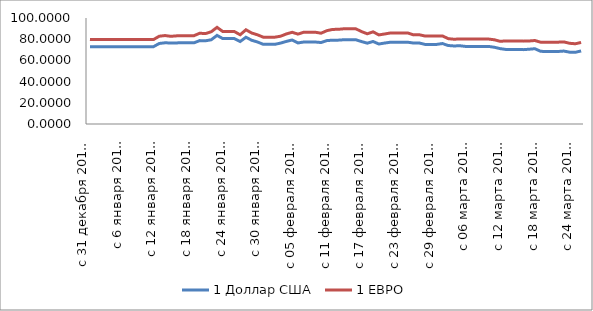
| Category | 1 Доллар США | 1 ЕВРО |
|---|---|---|
| с 31 декабря 2015 года | 72.883 | 79.697 |
| с 1 января 2016 года | 72.93 | 79.64 |
| со 2 января 2016 года | 72.93 | 79.64 |
| с 3 января 2016 года | 72.93 | 79.64 |
| с 4 января 2016 года | 72.93 | 79.64 |
| с 5 января 2016 года | 72.93 | 79.64 |
| с 6 января 2016 года | 72.93 | 79.64 |
| с 7 января 2016 года | 72.93 | 79.64 |
| с 8 января 2016 года | 72.93 | 79.64 |
| с 9 января 2016 года | 72.93 | 79.64 |
| с 10 января 2016 года | 72.93 | 79.64 |
| с 11 января 2016 года | 72.93 | 79.64 |
| с 12 января 2016 года | 75.951 | 82.809 |
| с 13 января 2016 года | 76.604 | 83.437 |
| с 14 января 2016 года | 76.428 | 82.718 |
| с 15 января 2016 года | 76.523 | 83.15 |
| с 16 января 2016 года | 76.565 | 83.295 |
| с 17 января 2016 года | 76.565 | 83.295 |
| с 18 января 2016 года | 76.565 | 83.295 |
| с 19 января 2016 года | 78.668 | 85.622 |
| с 20 января 2016 года | 78.486 | 85.299 |
| с 21 января 2016 года | 79.461 | 87.034 |
| с 22 января 2016 года | 83.591 | 91.181 |
| с 23 января 2016 года | 80.571 | 87.227 |
| с 24 января 2016 года | 80.571 | 87.227 |
| с 25 января 2016 года | 80.571 | 87.227 |
| с 26 января 2016 года | 77.796 | 84.16 |
| с 27 января 2016 года | 81.839 | 88.886 |
| с 28 января 2016 года | 78.997 | 85.846 |
| с 29 января 2016 года | 77.367 | 84.137 |
| с 30 января 2016 года | 75.172 | 81.908 |
| с 31 января 2016 года | 75.172 | 81.908 |
| с 01 февраля 2016 года | 75.172 | 81.908 |
| с 02 февраля 2016 года | 76.326 | 82.814 |
| с 03 февраля 2016 года | 77.927 | 84.972 |
| с 04 февраля 2016 года | 79.259 | 86.512 |
| с 05 февраля 2016 года | 76.461 | 84.81 |
| с 06 февраля 2016 года | 77.341 | 86.575 |
| с 07 февраля 2016 года | 77.341 | 86.575 |
| с 08 февраля 2016 года | 77.341 | 86.575 |
| с 09 февраля 2016 года | 76.861 | 85.654 |
| с 10 февраля 2016 года | 78.68 | 88.044 |
| с 11 февраля 2016 года | 79.069 | 89.221 |
| с 12 февраля 2016 года | 79.114 | 89.344 |
| с 13 февраля 2016 года | 79.495 | 89.845 |
| с 14 февраля 2016 года | 79.495 | 89.845 |
| с 15 февраля 2016 года | 79.495 | 89.845 |
| с 16 февраля 2016 года | 77.779 | 87.19 |
| с 17 февраля 2016 года | 76.245 | 85.089 |
| с 18 февраля 2016 года | 77.85 | 86.959 |
| с 19 февраля 2016 года | 75.458 | 84.052 |
| с 20 февраля 2016 года | 76.366 | 84.919 |
| с 21 февраля 2016 года | 77.133 | 85.856 |
| с 22 февраля 2016 года | 77.133 | 85.856 |
| с 23 февраля 2016 года | 77.133 | 85.856 |
| с 24 февраля 2016 года | 77.133 | 85.856 |
| с 25 февраля 2016 года | 76.393 | 84.078 |
| с 26 февраля 2016 года | 76.393 | 84.216 |
| с 27 февраля 2016 года | 75.09 | 82.975 |
| с 28 февраля 2016 года | 75.09 | 82.975 |
| с 29 февраля 2016 года | 75.09 | 82.975 |
| с 01 марта 2016 года | 75.899 | 83.102 |
| с 02 марта 2016 года | 74.054 | 80.533 |
| с 03 марта 2016 года | 73.626 | 79.972 |
| с 04 марта 2016 года | 73.824 | 80.21 |
| с 05 марта 2016 года | 73.185 | 80.116 |
| с 06 марта 2016 года | 73.185 | 80.116 |
| с 07 марта 2016 года | 73.185 | 80.116 |
| с 08 марта 2016 года | 73.185 | 80.116 |
| с 09 марта 2016 года | 73.185 | 80.116 |
| с 10 марта 2016 года | 72.378 | 79.449 |
| с 11 марта 2016 года | 71.093 | 77.982 |
| с 12 марта 2016 года | 70.307 | 78.413 |
| с 13 марта 2016 года | 70.307 | 78.413 |
| с 14 марта 2016 года | 70.307 | 78.413 |
| с 15 марта 2016 года | 70.154 | 78.18 |
| с 16 марта 2016 года | 70.541 | 78.328 |
| с 17 марта 2016 года | 71.026 | 78.753 |
| с 18 марта 2016 года | 68.56 | 77.157 |
| с 19 марта 2016 года | 68.403 | 77.199 |
| с 20 марта 2016 года | 68.403 | 77.199 |
| с 21 марта 2016 года | 68.403 | 77.199 |
| с 22 марта 2016 года | 68.809 | 77.465 |
| с 23 марта 2016 года | 67.776 | 76.14 |
| с 24 марта 2016 года | 67.641 | 75.69 |
| с 25 марта 2016 года | 68.933 | 76.929 |